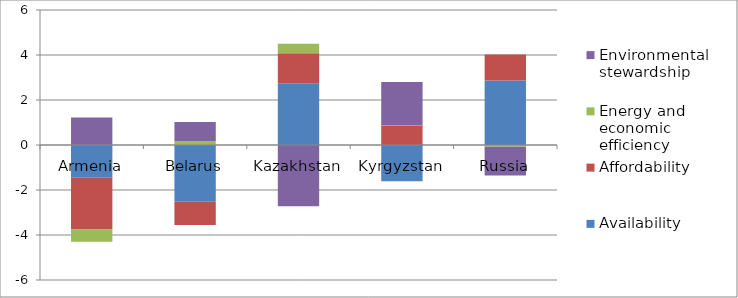
| Category | Availability | Affordability | Energy and economic efficiency | Environmental stewardship |
|---|---|---|---|---|
| Armenia | -1.46 | -2.3 | -0.54 | 1.22 |
| Belarus | -2.526 | -1.03 | 0.17 | 0.85 |
| Kazakhstan | 2.74 | 1.34 | 0.42 | -2.72 |
| Kyrgyzstan | -1.614 | 0.84 | 0.022 | 1.94 |
| Russia | 2.863 | 1.16 | -0.074 | -1.285 |